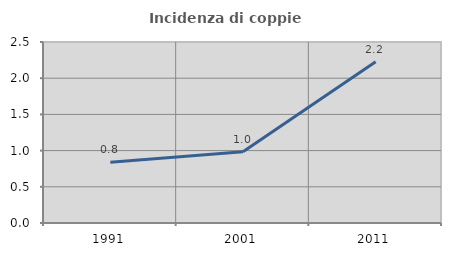
| Category | Incidenza di coppie miste |
|---|---|
| 1991.0 | 0.838 |
| 2001.0 | 0.983 |
| 2011.0 | 2.228 |